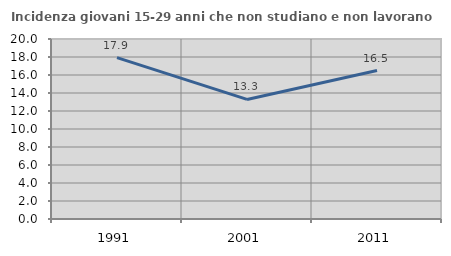
| Category | Incidenza giovani 15-29 anni che non studiano e non lavorano  |
|---|---|
| 1991.0 | 17.929 |
| 2001.0 | 13.285 |
| 2011.0 | 16.496 |